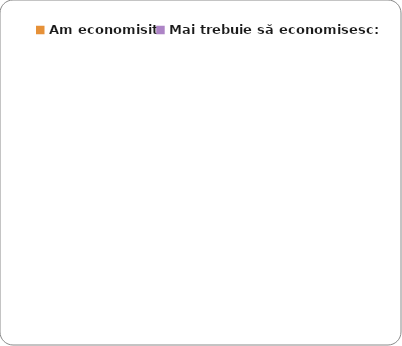
| Category | Series 0 |
|---|---|
| Am economisit: | 0 |
| Mai trebuie să economisesc: | 0 |